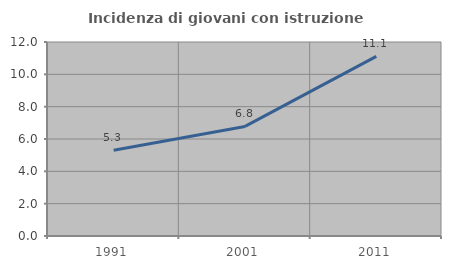
| Category | Incidenza di giovani con istruzione universitaria |
|---|---|
| 1991.0 | 5.299 |
| 2001.0 | 6.778 |
| 2011.0 | 11.111 |